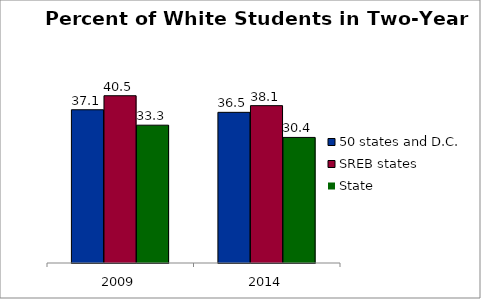
| Category | 50 states and D.C. | SREB states | State |
|---|---|---|---|
| 2009 | 37.076 | 40.469 | 33.344 |
| 2014 | 36.45 | 38.068 | 30.38 |